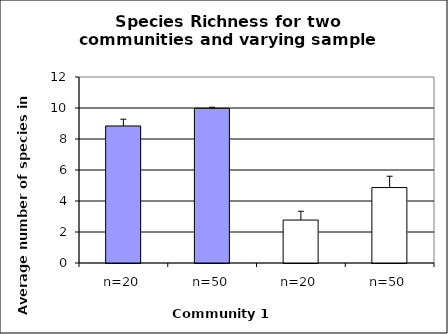
| Category | Series 0 |
|---|---|
| 0 | 8.84 |
| 1 | 9.98 |
| 2 | 2.771 |
| 3 | 4.866 |